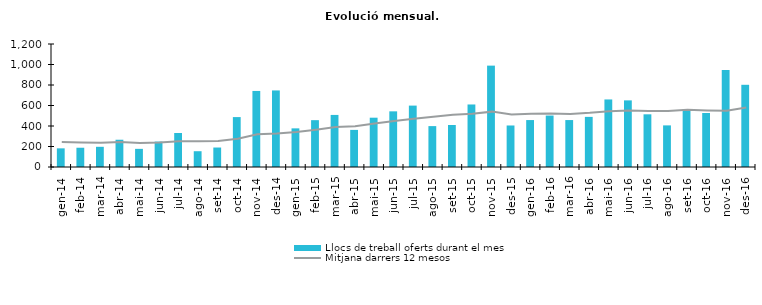
| Category | Llocs de treball oferts durant el mes |
|---|---|
| gen-14 | 182 |
| feb-14 | 188 |
| mar-14 | 197 |
| abr-14 | 266 |
| mai-14 | 177 |
| jun-14 | 248 |
| jul-14 | 332 |
| ago-14 | 154 |
| set-14 | 190 |
| oct-14 | 487 |
| nov-14 | 742 |
| des-14 | 747 |
| gen-15 | 377 |
| feb-15 | 457 |
| mar-15 | 508 |
| abr-15 | 362 |
| mai-15 | 481 |
| jun-15 | 543 |
| jul-15 | 599 |
| ago-15 | 399 |
| set-15 | 410 |
| oct-15 | 610 |
| nov-15 | 989 |
| des-15 | 405 |
| gen-16 | 458 |
| feb-16 | 502 |
| mar-16 | 458 |
| abr-16 | 489 |
| mai-16 | 659 |
| jun-16 | 650 |
| jul-16 | 514 |
| ago-16 | 406 |
| set-16 | 566 |
| oct-16 | 527 |
| nov-16 | 946 |
| des-16 | 802 |